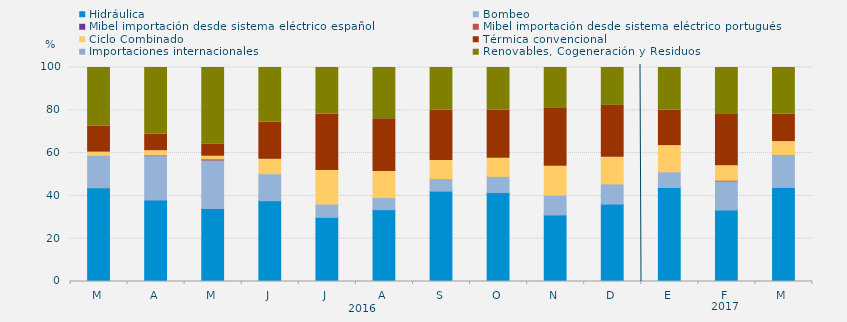
| Category | Hidráulica | Bombeo | Mibel importación desde sistema eléctrico español | Mibel importación desde sistema eléctrico portugués | Ciclo Combinado | Térmica convencional | Importaciones internacionales | Renovables, Cogeneración y Residuos |
|---|---|---|---|---|---|---|---|---|
| M | 43.775 | 15.197 | 0 | 0 | 1.469 | 12.091 | 0 | 27.467 |
| A | 38.09 | 20.729 | 0 | 0.278 | 2.025 | 7.708 | 0 | 31.169 |
| M | 34.117 | 22.648 | 0 | 0.538 | 1.232 | 5.645 | 0 | 35.82 |
| J | 37.755 | 12.593 | 0 | 0 | 6.759 | 17.315 | 0 | 25.579 |
| J | 29.951 | 6.228 | 0 | 0 | 15.636 | 26.478 | 0 | 21.707 |
| A | 33.591 | 5.589 | 0 | 0 | 12.265 | 24.597 | 0 | 23.958 |
| S | 42.211 | 5.903 | 0 | 0 | 8.391 | 23.542 | 0 | 19.954 |
| O | 41.555 | 7.572 | 0 | 0 | 8.468 | 22.469 | 0 | 19.937 |
| N | 31.088 | 9.259 | 0 | 0 | 13.495 | 27.361 | 0 | 18.796 |
| D | 36.178 | 9.409 | 0 | 0 | 12.522 | 24.194 | 0 | 17.697 |
| E | 43.929 | 7.303 | 0 | 0 | 12.254 | 16.51 | 0 | 20.004 |
| F | 33.383 | 13.641 | 0 | 0.298 | 6.82 | 23.884 | 0 | 21.974 |
| M | 43.966 | 14.984 | 0 | 0.135 | 6.303 | 12.943 | 0 | 21.669 |